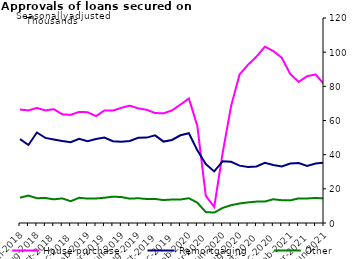
| Category | House purchase | Remortgaging | Other |
|---|---|---|---|
| Jun-2018 | 66418 | 49109 | 14835 |
| Jul-2018 | 65902 | 45685 | 16036 |
| Aug-2018 | 67359 | 52966 | 14512 |
| Sep-2018 | 65891 | 49816 | 14635 |
| Oct-2018 | 66641 | 48884 | 13848 |
| Nov-2018 | 63628 | 48030 | 14396 |
| Dec-2018 | 63313 | 47257 | 12732 |
| Jan-2019 | 65007 | 49320 | 14771 |
| Feb-2019 | 64862 | 47910 | 14278 |
| Mar-2019 | 62554 | 49172 | 14351 |
| Apr-2019 | 65882 | 50007 | 14786 |
| May-2019 | 65804 | 47861 | 15420 |
| Jun-2019 | 67428 | 47617 | 15198 |
| Jul-2019 | 68688 | 48011 | 14251 |
| Aug-2019 | 67097 | 49872 | 14488 |
| Sep-2019 | 66276 | 49990 | 14052 |
| Oct-2019 | 64379 | 51293 | 14071 |
| Nov-2019 | 64196 | 47670 | 13410 |
| Dec-2019 | 65905 | 48593 | 13754 |
| Jan-2020 | 69293 | 51349 | 13738 |
| Feb-2020 | 72904 | 52563 | 14517 |
| Mar-2020 | 56832 | 42528 | 11890 |
| Apr-2020 | 15935 | 34470 | 6373 |
| May-2020 | 9383 | 30212 | 6103 |
| Jun-2020 | 41047 | 36194 | 8819 |
| Jul-2020 | 68506 | 35792 | 10427 |
| Aug-2020 | 86921 | 33568 | 11417 |
| Sep-2020 | 92619 | 32785 | 12053 |
| Oct-2020 | 97344 | 33136 | 12519 |
| Nov-2020 | 103215 | 35187 | 12572 |
| Dec-2020 | 100673 | 33935 | 13897 |
| Jan-2021 | 96744 | 33037 | 13333 |
| Feb-2021 | 87212 | 34830 | 13236 |
| Mar-2021 | 82630 | 35074 | 14412 |
| Apr-2021 | 85927 | 33419 | 14355 |
| May-2021 | 86949 | 34825 | 14661 |
| Jun-2021 | 81338 | 35396 | 14373 |